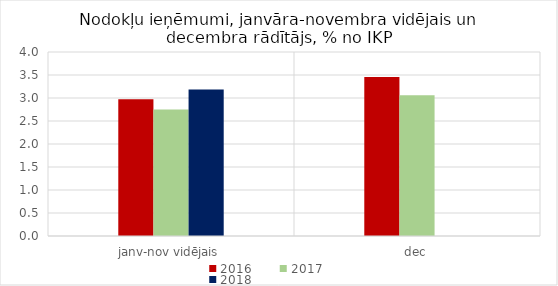
| Category | 2016 | 2017 | 2018 |
|---|---|---|---|
| janv-nov vidējais | 2.974 | 2.751 | 3.187 |
| dec | 3.458 | 3.057 | 0 |